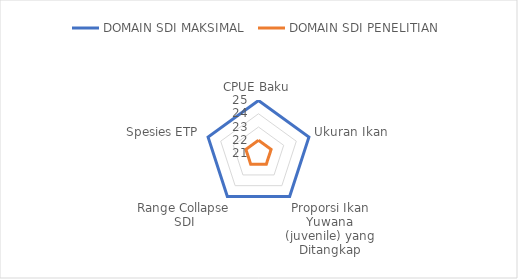
| Category | DOMAIN SDI MAKSIMAL  | DOMAIN SDI PENELITIAN  |
|---|---|---|
| CPUE Baku | 25 | 22 |
| Ukuran Ikan | 25 | 22 |
| Proporsi Ikan Yuwana (juvenile) yang Ditangkap | 25 | 22 |
| Range Collapse SDI | 25 | 22 |
| Spesies ETP | 25 | 22 |